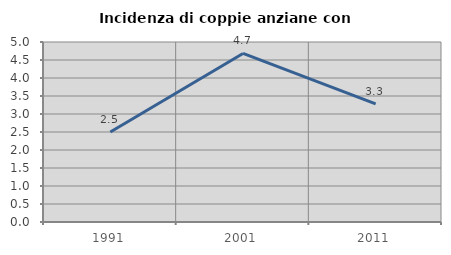
| Category | Incidenza di coppie anziane con figli |
|---|---|
| 1991.0 | 2.5 |
| 2001.0 | 4.682 |
| 2011.0 | 3.282 |